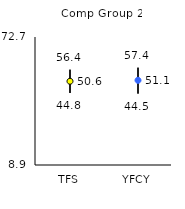
| Category | 25th | 75th | Mean |
|---|---|---|---|
| TFS | 44.8 | 56.4 | 50.64 |
| YFCY | 44.5 | 57.4 | 51.11 |